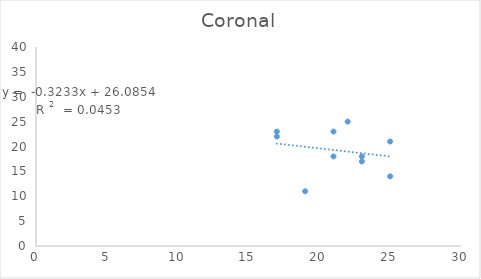
| Category | Coronal |
|---|---|
| 17.0 | 22 |
| 17.0 | 23 |
| 23.0 | 18 |
| 23.0 | 17 |
| 21.0 | 23 |
| 21.0 | 18 |
| 19.0 | 11 |
| 22.0 | 25 |
| 25.0 | 21 |
| 25.0 | 14 |